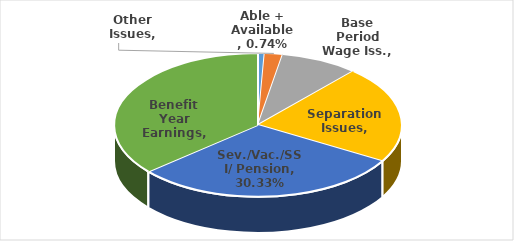
| Category | Series 0 |
|---|---|
| Able + Available | 0.007 |
| Other Issues | 0.02 |
| Base Period Wage Iss. | 0.088 |
| Separation Issues | 0.219 |
| Sev./Vac./SSI/ Pension | 0.303 |
| Benefit Year Earnings | 0.362 |